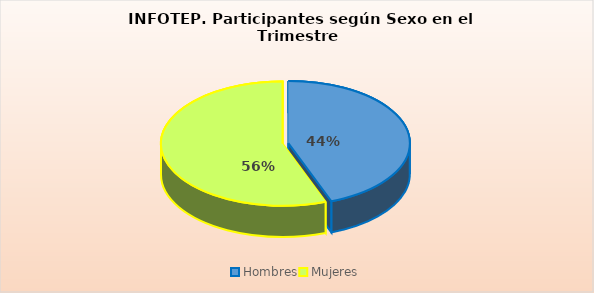
| Category | Series 0 |
|---|---|
| Hombres | 106310 |
| Mujeres | 134016 |